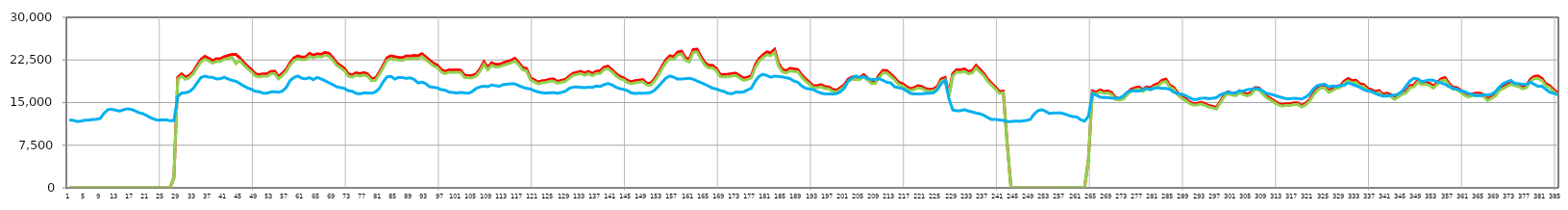
| Category | Прием СТЭЦ | Прием ПСМера 10 кВ | Отдача ПСМера 10 кВ |
|---|---|---|---|
| 0 | 0 | 21.247 | 11927.375 |
| 1 | 0 | 21.419 | 11884.124 |
| 2 | 22 | 21.518 | 11671.503 |
| 3 | 0 | 21.272 | 11733.836 |
| 4 | 0 | 21.304 | 11895.609 |
| 5 | 0 | 21.33 | 11912.711 |
| 6 | 0 | 21.388 | 12017.392 |
| 7 | 0 | 21.434 | 12055.303 |
| 8 | 0 | 21.38 | 12211.37 |
| 9 | 0 | 21.395 | 13133.131 |
| 10 | 0 | 20.629 | 13767.094 |
| 11 | 0 | 22.037 | 13822.603 |
| 12 | 0 | 22.665 | 13665.756 |
| 13 | 0 | 22.711 | 13500.539 |
| 14 | 22 | 22.651 | 13747.376 |
| 15 | 0 | 22.241 | 13897.446 |
| 16 | 0 | 22.327 | 13809.279 |
| 17 | 0 | 22.487 | 13545.065 |
| 18 | 0 | 22.604 | 13221.048 |
| 19 | 0 | 22.59 | 13056.817 |
| 20 | 0 | 22.693 | 12721.496 |
| 21 | 0 | 23.026 | 12337.221 |
| 22 | 0 | 23.146 | 12051.595 |
| 23 | 0 | 23.598 | 11896.963 |
| 24 | 0 | 22.413 | 11964.085 |
| 25 | 0 | 20.808 | 11960.884 |
| 26 | 0 | 21.257 | 11820.887 |
| 27 | 1760 | 1746.8 | 11804.775 |
| 28 | 19448 | 19101.052 | 16047.003 |
| 29 | 20042 | 19638.834 | 16691.109 |
| 30 | 19448 | 19087.97 | 16722.029 |
| 31 | 19800 | 19411.53 | 16935.089 |
| 32 | 20438 | 20058.537 | 17476.263 |
| 33 | 21582 | 21168.643 | 18477.567 |
| 34 | 22616 | 22156.222 | 19414.303 |
| 35 | 23144 | 22653.727 | 19654.445 |
| 36 | 22792 | 22332.737 | 19464.711 |
| 37 | 22374 | 21928.669 | 19434.894 |
| 38 | 22726 | 22244.353 | 19157.554 |
| 39 | 22726 | 22259.11 | 19218.256 |
| 40 | 23078 | 22593.379 | 19450.439 |
| 41 | 23276 | 22788.599 | 19154.423 |
| 42 | 23474 | 22982.73 | 18909.155 |
| 43 | 23474 | 21832.895 | 18754.393 |
| 44 | 22880 | 22421.075 | 18355.745 |
| 45 | 22088 | 21643.225 | 17944.14 |
| 46 | 21406 | 20976.974 | 17585.205 |
| 47 | 20834 | 20418.158 | 17341.174 |
| 48 | 20086 | 19697.921 | 16976.587 |
| 49 | 19910 | 19506.887 | 16923.024 |
| 50 | 20064 | 19678.121 | 16669.536 |
| 51 | 20042 | 19624.426 | 16633.176 |
| 52 | 20460 | 20057.985 | 16877.091 |
| 53 | 20526 | 20129.73 | 16906.853 |
| 54 | 19580 | 19184.137 | 16827.202 |
| 55 | 20174 | 19781.731 | 17025.039 |
| 56 | 20856 | 20462.864 | 17665.693 |
| 57 | 22022 | 21591.725 | 18870.683 |
| 58 | 22880 | 22428.844 | 19430.127 |
| 59 | 23210 | 22703.958 | 19674.485 |
| 60 | 22990 | 22537.037 | 19288.89 |
| 61 | 23034 | 22570.158 | 19191.664 |
| 62 | 23650 | 23151.927 | 19383.156 |
| 63 | 23342 | 22851.358 | 19024.359 |
| 64 | 23584 | 23097.454 | 19432.148 |
| 65 | 23496 | 23020.454 | 19165.021 |
| 66 | 23826 | 23326.31 | 18836.892 |
| 67 | 23672 | 23155.378 | 18492.83 |
| 68 | 22924 | 22454.569 | 18184.129 |
| 69 | 22022 | 21581.256 | 17777.002 |
| 70 | 21516 | 21100.227 | 17637.863 |
| 71 | 21010 | 20601.006 | 17503.823 |
| 72 | 20064 | 19653.688 | 17078.763 |
| 73 | 19844 | 19475.194 | 17000.214 |
| 74 | 20240 | 19823.052 | 16627.876 |
| 75 | 20086 | 19679.952 | 16541.942 |
| 76 | 20262 | 19857.968 | 16696.531 |
| 77 | 20042 | 19652.974 | 16698.736 |
| 78 | 19228 | 18866.146 | 16644.429 |
| 79 | 19294 | 18899.213 | 16865.52 |
| 80 | 20306 | 19927.341 | 17471.525 |
| 81 | 21538 | 21131.327 | 18648.891 |
| 82 | 22880 | 22401.547 | 19519.859 |
| 83 | 23210 | 22742.81 | 19616.685 |
| 84 | 23078 | 22600.282 | 19139.845 |
| 85 | 22946 | 22478.771 | 19432.997 |
| 86 | 22902 | 22443.511 | 19389.454 |
| 87 | 23210 | 22720.879 | 19266.678 |
| 88 | 23166 | 22685.836 | 19366.28 |
| 89 | 23298 | 22793.546 | 19070.991 |
| 90 | 23232 | 22746.057 | 18461.516 |
| 91 | 23606 | 23108.379 | 18609.479 |
| 92 | 23034 | 22557.364 | 18320.254 |
| 93 | 22462 | 22001.397 | 17777.577 |
| 94 | 21912 | 21479.558 | 17694.617 |
| 95 | 21582 | 21140.535 | 17580.471 |
| 96 | 20790 | 20381.112 | 17272.119 |
| 97 | 20504 | 20101.528 | 17176.217 |
| 98 | 20746 | 20347.158 | 16852.109 |
| 99 | 20724 | 20296.069 | 16771.911 |
| 100 | 20768 | 20353.471 | 16684.558 |
| 101 | 20702 | 20287.809 | 16789.554 |
| 102 | 19800 | 19414.283 | 16705.409 |
| 103 | 19756 | 19382.406 | 16650.435 |
| 104 | 19756 | 19382.903 | 16949.555 |
| 105 | 20042 | 19669.705 | 17497.03 |
| 106 | 20922 | 20503.177 | 17758.401 |
| 107 | 22176 | 21751.326 | 17898.037 |
| 108 | 21186 | 20763.735 | 17798.835 |
| 109 | 22000 | 21559.484 | 18094.977 |
| 110 | 21736 | 21280.325 | 17978.41 |
| 111 | 21714 | 21301.012 | 17862.861 |
| 112 | 22000 | 21563.296 | 18175.421 |
| 113 | 22220 | 21759.345 | 18230.114 |
| 114 | 22440 | 21989.957 | 18314.34 |
| 115 | 22792 | 22325.374 | 18280.083 |
| 116 | 22044 | 21615.94 | 17991.964 |
| 117 | 21164 | 20767.732 | 17703.253 |
| 118 | 20988 | 20577.82 | 17511.671 |
| 119 | 19338 | 18987.948 | 17395.366 |
| 120 | 19008 | 18648.711 | 17091.136 |
| 121 | 18612 | 18277.702 | 16870.783 |
| 122 | 18832 | 18493.515 | 16733.646 |
| 123 | 18898 | 18551.247 | 16664.887 |
| 124 | 19118 | 18774.264 | 16719.813 |
| 125 | 19140 | 18753.296 | 16753.463 |
| 126 | 18722 | 18398.732 | 16626.432 |
| 127 | 18920 | 18570.115 | 16798.09 |
| 128 | 19074 | 18729.857 | 16999.272 |
| 129 | 19646 | 19274.723 | 17488.838 |
| 130 | 20152 | 19780.969 | 17721.386 |
| 131 | 20328 | 19949.495 | 17747.927 |
| 132 | 20482 | 20098.516 | 17688.416 |
| 133 | 20196 | 19819.302 | 17622.303 |
| 134 | 20482 | 20082.857 | 17726.575 |
| 135 | 20108 | 19738.393 | 17673.091 |
| 136 | 20526 | 20138.509 | 17906.426 |
| 137 | 20548 | 20142.565 | 17842.707 |
| 138 | 21230 | 20835.349 | 18155.342 |
| 139 | 21406 | 20978.906 | 18348.894 |
| 140 | 20812 | 20429.904 | 18137.84 |
| 141 | 20152 | 19772.119 | 17736.858 |
| 142 | 19624 | 19230.503 | 17472.24 |
| 143 | 19360 | 19012.478 | 17322.793 |
| 144 | 18920 | 18561.607 | 17106.357 |
| 145 | 18656 | 18316.123 | 16710.6 |
| 146 | 18854 | 18483.219 | 16607.596 |
| 147 | 18942 | 18587.848 | 16639.699 |
| 148 | 19052 | 18672.797 | 16641.149 |
| 149 | 18414 | 18077.871 | 16678.452 |
| 150 | 18392 | 18047.411 | 16765.13 |
| 151 | 19140 | 18787.922 | 17144.256 |
| 152 | 20174 | 19787.621 | 17842.935 |
| 153 | 21428 | 20990.417 | 18603.763 |
| 154 | 22550 | 22093.739 | 19320.348 |
| 155 | 23232 | 22755.429 | 19671.287 |
| 156 | 23100 | 22623.406 | 19478.244 |
| 157 | 23892 | 23397.555 | 19126.777 |
| 158 | 24046 | 23551.717 | 19154.641 |
| 159 | 22880 | 22449.065 | 19199.21 |
| 160 | 22616 | 22156.054 | 19277.292 |
| 161 | 24332 | 23815.354 | 19118.184 |
| 162 | 24398 | 23900.115 | 18793.047 |
| 163 | 23122 | 22655.836 | 18522.076 |
| 164 | 22044 | 21600.798 | 18231.008 |
| 165 | 21538 | 21100.347 | 17890.079 |
| 166 | 21560 | 21124.375 | 17539.275 |
| 167 | 20988 | 20567.295 | 17386.681 |
| 168 | 19932 | 19538.613 | 17113.666 |
| 169 | 19932 | 19542.622 | 16956.913 |
| 170 | 19976 | 19567.686 | 16629.08 |
| 171 | 20108 | 19692.124 | 16552.97 |
| 172 | 20174 | 19765.54 | 16843.045 |
| 173 | 19712 | 19324.231 | 16801.135 |
| 174 | 19294 | 18921.196 | 16862.823 |
| 175 | 19448 | 19064.459 | 17214.318 |
| 176 | 19712 | 19341.129 | 17519.876 |
| 177 | 21604 | 21172.799 | 18754.725 |
| 178 | 22748 | 22269.452 | 19618.287 |
| 179 | 23408 | 22925.28 | 19970.76 |
| 180 | 23914 | 23417.539 | 19770.752 |
| 181 | 23738 | 23242.293 | 19466.998 |
| 182 | 24354 | 23834.26 | 19653.635 |
| 183 | 21934 | 21483.447 | 19608.934 |
| 184 | 20856 | 20436.879 | 19512.892 |
| 185 | 20614 | 20203.249 | 19380.056 |
| 186 | 21032 | 20584.379 | 19212.854 |
| 187 | 20922 | 20477.87 | 18784.512 |
| 188 | 20812 | 20402.951 | 18564.389 |
| 189 | 19888 | 19476.022 | 17926.502 |
| 190 | 19162 | 18783.509 | 17533.447 |
| 191 | 18568 | 18206 | 17389.786 |
| 192 | 17952 | 17595.766 | 17290.467 |
| 193 | 17974 | 17625.132 | 16910.228 |
| 194 | 18150 | 17781.557 | 16681.836 |
| 195 | 17820 | 17472.248 | 16507.014 |
| 196 | 17754 | 17416.766 | 16537.573 |
| 197 | 17314 | 16981.642 | 16492.902 |
| 198 | 17182 | 16844.31 | 16596.978 |
| 199 | 17622 | 17276.326 | 16886.786 |
| 200 | 18150 | 17798.625 | 17548.354 |
| 201 | 19118 | 18750.938 | 18808.161 |
| 202 | 19514 | 19113.179 | 19367.516 |
| 203 | 19426 | 19041.171 | 19687.017 |
| 204 | 19426 | 19062.738 | 19431.101 |
| 205 | 19910 | 19497.224 | 19579.309 |
| 206 | 19338 | 18949.912 | 19271.704 |
| 207 | 18700 | 18334.285 | 19035.445 |
| 208 | 18744 | 18365.775 | 19073.992 |
| 209 | 19866 | 19424.597 | 19222.214 |
| 210 | 20680 | 20240.33 | 18895.982 |
| 211 | 20614 | 20183.641 | 18574.726 |
| 212 | 19998 | 19589.85 | 18465.334 |
| 213 | 19338 | 18950.077 | 17775.716 |
| 214 | 18590 | 18213.565 | 17607.297 |
| 215 | 18326 | 17978.852 | 17476.318 |
| 216 | 17842 | 17475.234 | 17077.355 |
| 217 | 17446 | 17108.276 | 16648.097 |
| 218 | 17622 | 17283.362 | 16502.876 |
| 219 | 17974 | 17596.035 | 16527.952 |
| 220 | 17820 | 17466.872 | 16544.586 |
| 221 | 17446 | 17103.731 | 16616.783 |
| 222 | 17314 | 16987.199 | 16660.704 |
| 223 | 17402 | 17059.005 | 16703.98 |
| 224 | 17842 | 17497.343 | 17280.22 |
| 225 | 19162 | 18768.385 | 18336.256 |
| 226 | 19426 | 19039.506 | 18924.985 |
| 227 | 16500 | 16174.786 | 15678.457 |
| 228 | 20086 | 19692.752 | 13697.36 |
| 229 | 20790 | 20370.292 | 13560.387 |
| 230 | 20746 | 20331.467 | 13583.744 |
| 231 | 20922 | 20503.443 | 13752.792 |
| 232 | 20482 | 20063.623 | 13513.906 |
| 233 | 20636 | 20214.324 | 13361.105 |
| 234 | 21538 | 21092.021 | 13165.213 |
| 235 | 20834 | 20419.293 | 13024.579 |
| 236 | 20108 | 19726.836 | 12777.693 |
| 237 | 19140 | 18756.075 | 12363.975 |
| 238 | 18392 | 18048.525 | 12032.085 |
| 239 | 17732 | 17392.155 | 12055.047 |
| 240 | 16940 | 16607.713 | 11928.677 |
| 241 | 17006 | 16738.362 | 11878.923 |
| 242 | 8096 | 7940.163 | 11672.61 |
| 243 | 0 | 24.616 | 11652.233 |
| 244 | 0 | 21.699 | 11744.916 |
| 245 | 0 | 21.76 | 11709.377 |
| 246 | 0 | 21.788 | 11765.685 |
| 247 | 0 | 21.83 | 11858.378 |
| 248 | 0 | 21.653 | 12053.804 |
| 249 | 0 | 21.311 | 12998.554 |
| 250 | 0 | 20.532 | 13584.17 |
| 251 | 0 | 20.899 | 13754.079 |
| 252 | 0 | 22.676 | 13430.178 |
| 253 | 0 | 23.061 | 13068.551 |
| 254 | 0 | 23.272 | 13187.328 |
| 255 | 0 | 23.086 | 13183.285 |
| 256 | 0 | 23.136 | 13168.154 |
| 257 | 0 | 23.12 | 12959.349 |
| 258 | 0 | 23.098 | 12713.255 |
| 259 | 0 | 23.061 | 12531.396 |
| 260 | 0 | 23.305 | 12466.334 |
| 261 | 0 | 22.701 | 11978.598 |
| 262 | 0 | 21.098 | 11729.501 |
| 263 | 5104 | 5050.902 | 12635.601 |
| 264 | 17028 | 16733.552 | 16586.328 |
| 265 | 16830 | 16499.236 | 16322.476 |
| 266 | 17226 | 16886.446 | 15955.428 |
| 267 | 16940 | 16622.674 | 15887.739 |
| 268 | 17050 | 16704.544 | 15895.59 |
| 269 | 16742 | 16420.288 | 15776.137 |
| 270 | 15862 | 15539.729 | 15779.281 |
| 271 | 15730 | 15439.853 | 15791.031 |
| 272 | 15906 | 15610.079 | 16179.499 |
| 273 | 16720 | 16387.952 | 16840.708 |
| 274 | 17336 | 16986.272 | 17076.443 |
| 275 | 17600 | 17257.298 | 17054.604 |
| 276 | 17754 | 17401.358 | 17051.315 |
| 277 | 17292 | 16942.008 | 17244.802 |
| 278 | 17754 | 17407.856 | 17528.7 |
| 279 | 17600 | 17261.217 | 17279.443 |
| 280 | 18106 | 17745.527 | 17552.786 |
| 281 | 18348 | 17974.263 | 17598.01 |
| 282 | 18942 | 18563.72 | 17492.324 |
| 283 | 19118 | 18719.662 | 17497.94 |
| 284 | 18040 | 17693.712 | 17350.531 |
| 285 | 17666 | 17341.63 | 16826.684 |
| 286 | 16720 | 16393.929 | 16581.827 |
| 287 | 16104 | 15793.132 | 16504.676 |
| 288 | 15708 | 15413.784 | 16242.233 |
| 289 | 15158 | 14865.142 | 15878.925 |
| 290 | 14828 | 14561.338 | 15572.093 |
| 291 | 14850 | 14571.516 | 15550.235 |
| 292 | 15048 | 14761.67 | 15760.684 |
| 293 | 14828 | 14539.125 | 15789.849 |
| 294 | 14498 | 14220.576 | 15690.186 |
| 295 | 14344 | 14076.264 | 15769.837 |
| 296 | 14146 | 13868.297 | 15859.085 |
| 297 | 15202 | 14931.477 | 16365.483 |
| 298 | 16324 | 16003.791 | 16635.171 |
| 299 | 16918 | 16579.182 | 16823.994 |
| 300 | 16654 | 16335.654 | 16697.358 |
| 301 | 16522 | 16213.245 | 16732.741 |
| 302 | 17072 | 16738.716 | 17053.233 |
| 303 | 16720 | 16395.949 | 17023.893 |
| 304 | 16478 | 16179.502 | 17296.663 |
| 305 | 16808 | 16488.824 | 17344.387 |
| 306 | 17644 | 17323.742 | 17509.276 |
| 307 | 17578 | 17231.127 | 17393.841 |
| 308 | 16808 | 16491.654 | 17060.997 |
| 309 | 16126 | 15825.132 | 16602.479 |
| 310 | 15730 | 15434.889 | 16466.425 |
| 311 | 15246 | 14978.155 | 16297.185 |
| 312 | 14872 | 14595.972 | 16066.92 |
| 313 | 14652 | 14379.256 | 15865.015 |
| 314 | 14806 | 14520.225 | 15687.992 |
| 315 | 14784 | 14490.25 | 15674.86 |
| 316 | 14938 | 14645.091 | 15757.406 |
| 317 | 14960 | 14685.592 | 15696.598 |
| 318 | 14498 | 14231.66 | 15630.112 |
| 319 | 14872 | 14588.971 | 15943.054 |
| 320 | 15510 | 15217.488 | 16476.45 |
| 321 | 16588 | 16277.043 | 17358.99 |
| 322 | 17446 | 17113.595 | 17985.789 |
| 323 | 17930 | 17586.658 | 18157.485 |
| 324 | 17908 | 17562.168 | 18211.793 |
| 325 | 17138 | 16804.168 | 17756.775 |
| 326 | 17424 | 17100.008 | 17940.944 |
| 327 | 17886 | 17536.984 | 17784.124 |
| 328 | 17996 | 17652.098 | 18034.897 |
| 329 | 18788 | 18417.136 | 18054.818 |
| 330 | 19228 | 18815.531 | 18490.521 |
| 331 | 18854 | 18484.24 | 18236.488 |
| 332 | 18942 | 18570.142 | 17959.81 |
| 333 | 18282 | 17914.896 | 17683.836 |
| 334 | 18172 | 17821.913 | 17294.008 |
| 335 | 17512 | 17172.467 | 17041.405 |
| 336 | 17248 | 16913.905 | 16976.021 |
| 337 | 16940 | 16610.579 | 16632.262 |
| 338 | 17116 | 16759.55 | 16344.235 |
| 339 | 16456 | 16143.494 | 16141.484 |
| 340 | 16654 | 16316.625 | 16159.223 |
| 341 | 16412 | 16072.946 | 16269.14 |
| 342 | 15862 | 15559.114 | 16306.402 |
| 343 | 16324 | 16017.414 | 16537.824 |
| 344 | 16786 | 16474.279 | 17031.691 |
| 345 | 17072 | 16746.038 | 17984.92 |
| 346 | 17974 | 17618.775 | 18825.12 |
| 347 | 18128 | 17784.473 | 19273.302 |
| 348 | 18986 | 18596.246 | 19148.826 |
| 349 | 18524 | 18145.37 | 18682.783 |
| 350 | 18590 | 18224.676 | 18840.915 |
| 351 | 18392 | 18013.815 | 18978.12 |
| 352 | 17886 | 17539.27 | 18919.606 |
| 353 | 18568 | 18203.361 | 18640.75 |
| 354 | 19184 | 18819.18 | 18478.131 |
| 355 | 19404 | 19000.411 | 18199.14 |
| 356 | 18414 | 18077.381 | 17831.105 |
| 357 | 17666 | 17317.739 | 17529.557 |
| 358 | 17644 | 17307.704 | 17365.079 |
| 359 | 17204 | 16864.003 | 17071.927 |
| 360 | 16588 | 16284.752 | 16939.282 |
| 361 | 16302 | 15996.594 | 16632.217 |
| 362 | 16500 | 16169.781 | 16444.382 |
| 363 | 16654 | 16338.632 | 16193.246 |
| 364 | 16654 | 16313.993 | 16224.575 |
| 365 | 16368 | 16047.384 | 16338.375 |
| 366 | 15664 | 15370.575 | 16345.639 |
| 367 | 16038 | 15727.051 | 16458.166 |
| 368 | 16478 | 16181.466 | 16902.824 |
| 369 | 17446 | 17112.235 | 17723.336 |
| 370 | 17798 | 17463.031 | 18324.939 |
| 371 | 18216 | 17860.519 | 18643.874 |
| 372 | 18590 | 18204.999 | 18903.366 |
| 373 | 18348 | 17977.816 | 18368.894 |
| 374 | 18172 | 17818.092 | 18339.711 |
| 375 | 17732 | 17405.869 | 18198.62 |
| 376 | 17996 | 17632.662 | 18206.304 |
| 377 | 19074 | 18706.659 | 18603.216 |
| 378 | 19602 | 19202.937 | 18223.958 |
| 379 | 19690 | 19287.686 | 17860.687 |
| 380 | 19272 | 18867.107 | 17892.75 |
| 381 | 18326 | 17974.558 | 17348.795 |
| 382 | 17996 | 17638.067 | 16820.768 |
| 383 | 17314 | 16967.733 | 16639.544 |
| 384 | 16720 | 16411.255 | 16395.842 |